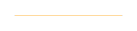
| Category | Series 1 |
|---|---|
| 0 | 1.025 |